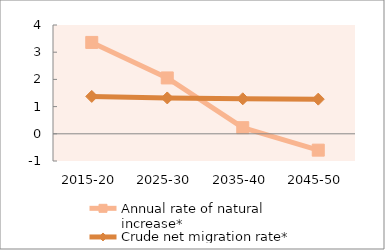
| Category | Annual rate of natural increase* | Crude net migration rate* |
|---|---|---|
| 2015-20 | 3.359 | 1.374 |
| 2025-30 | 2.054 | 1.318 |
| 2035-40 | 0.225 | 1.287 |
| 2045-50 | -0.601 | 1.274 |